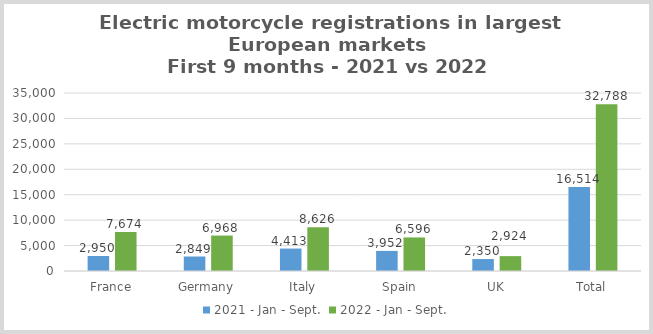
| Category | 2021 - Jan - Sept. | 2022 - Jan - Sept. |
|---|---|---|
| France | 2950 | 7674 |
| Germany | 2849 | 6968 |
| Italy | 4413 | 8626 |
| Spain | 3952 | 6596 |
| UK | 2350 | 2924 |
| Total | 16514 | 32788 |